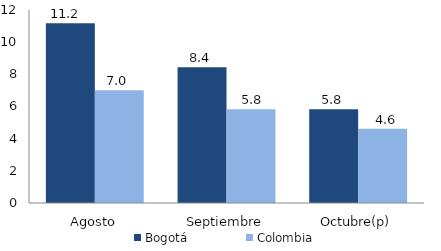
| Category | Bogotá | Colombia |
|---|---|---|
| Agosto | 11.184 | 7.014 |
| Septiembre | 8.439 | 5.829 |
| Octubre(p) | 5.829 | 4.614 |